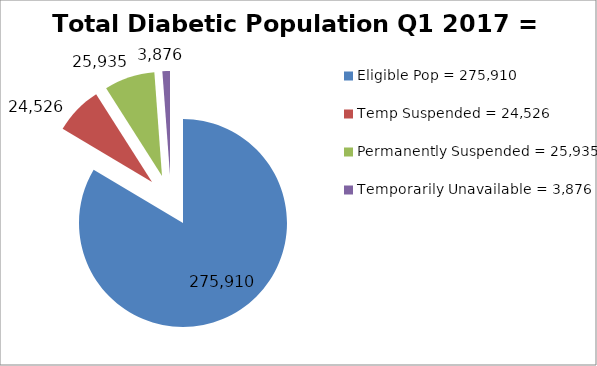
| Category | Total Diabetic Population Q1 2018 = 322,495 |
|---|---|
| Eligible Pop = 275,910 | 275910 |
| Temp Suspended = 24,526 | 24526 |
| Permanently Suspended = 25,935 | 25935 |
| Temporarily Unavailable = 3,876 | 3876 |